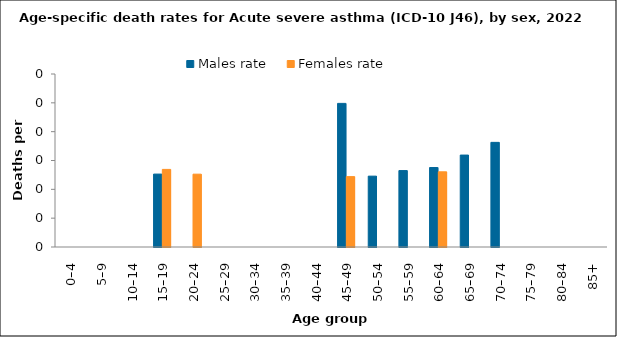
| Category | Males rate | Females rate |
|---|---|---|
| 0–4 | 0 | 0 |
| 5–9 | 0 | 0 |
| 10–14 | 0 | 0 |
| 15–19 | 0.126 | 0.135 |
| 20–24 | 0 | 0.126 |
| 25–29 | 0 | 0 |
| 30–34 | 0 | 0 |
| 35–39 | 0 | 0 |
| 40–44 | 0 | 0 |
| 45–49 | 0.249 | 0.122 |
| 50–54 | 0.123 | 0 |
| 55–59 | 0.133 | 0 |
| 60–64 | 0.138 | 0.13 |
| 65–69 | 0.159 | 0 |
| 70–74 | 0.181 | 0 |
| 75–79 | 0 | 0 |
| 80–84 | 0 | 0 |
| 85+ | 0 | 0 |